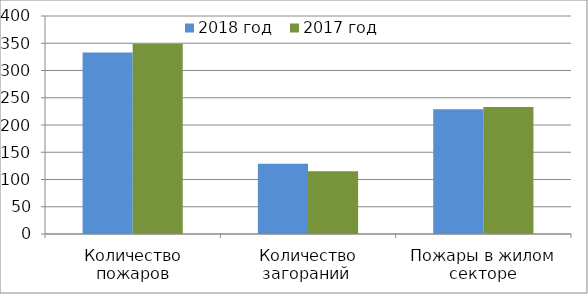
| Category | 2018 год | 2017 год |
|---|---|---|
| Количество пожаров | 333 | 349 |
| Количество загораний  | 129 | 115 |
| Пожары в жилом секторе | 229 | 233 |